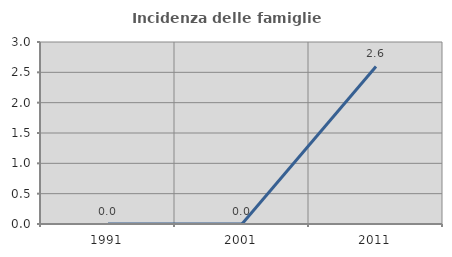
| Category | Incidenza delle famiglie numerose |
|---|---|
| 1991.0 | 0 |
| 2001.0 | 0 |
| 2011.0 | 2.597 |